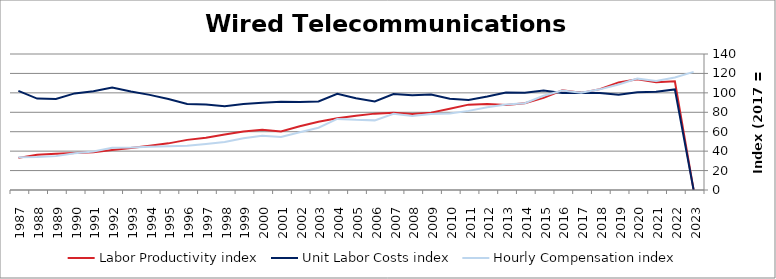
| Category | Labor Productivity index | Unit Labor Costs index | Hourly Compensation index |
|---|---|---|---|
| 2023.0 | 0 | 0 | 121.612 |
| 2022.0 | 111.91 | 103.517 | 115.846 |
| 2021.0 | 110.885 | 101.14 | 112.149 |
| 2020.0 | 113.893 | 100.653 | 114.636 |
| 2019.0 | 110.749 | 98.005 | 108.54 |
| 2018.0 | 103.841 | 99.773 | 103.605 |
| 2017.0 | 100 | 100 | 100 |
| 2016.0 | 102.572 | 99.783 | 102.349 |
| 2015.0 | 94.836 | 102.331 | 97.046 |
| 2014.0 | 89.257 | 100.085 | 89.334 |
| 2013.0 | 87.599 | 100.35 | 87.905 |
| 2012.0 | 88.497 | 96.176 | 85.113 |
| 2011.0 | 87.877 | 92.677 | 81.442 |
| 2010.0 | 83.647 | 94.025 | 78.649 |
| 2009.0 | 79.648 | 98.205 | 78.218 |
| 2008.0 | 78.18 | 97.54 | 76.256 |
| 2007.0 | 79.408 | 98.847 | 78.493 |
| 2006.0 | 78.617 | 91.17 | 71.676 |
| 2005.0 | 76.499 | 94.369 | 72.191 |
| 2004.0 | 73.838 | 99.054 | 73.139 |
| 2003.0 | 70.286 | 91.177 | 64.084 |
| 2002.0 | 65.658 | 90.622 | 59.501 |
| 2001.0 | 60.151 | 90.749 | 54.586 |
| 2000.0 | 62.083 | 89.805 | 55.754 |
| 1999.0 | 60.255 | 88.529 | 53.344 |
| 1998.0 | 57.191 | 86.295 | 49.353 |
| 1997.0 | 53.878 | 87.918 | 47.369 |
| 1996.0 | 51.596 | 88.471 | 45.648 |
| 1995.0 | 48.013 | 93.713 | 44.994 |
| 1994.0 | 45.457 | 97.917 | 44.51 |
| 1993.0 | 43.12 | 101.396 | 43.722 |
| 1992.0 | 41.134 | 105.469 | 43.384 |
| 1991.0 | 38.966 | 101.763 | 39.653 |
| 1990.0 | 38.058 | 99.434 | 37.842 |
| 1989.0 | 37.215 | 93.698 | 34.869 |
| 1988.0 | 36.2 | 94.121 | 34.072 |
| 1987.0 | 33.083 | 102.097 | 33.776 |